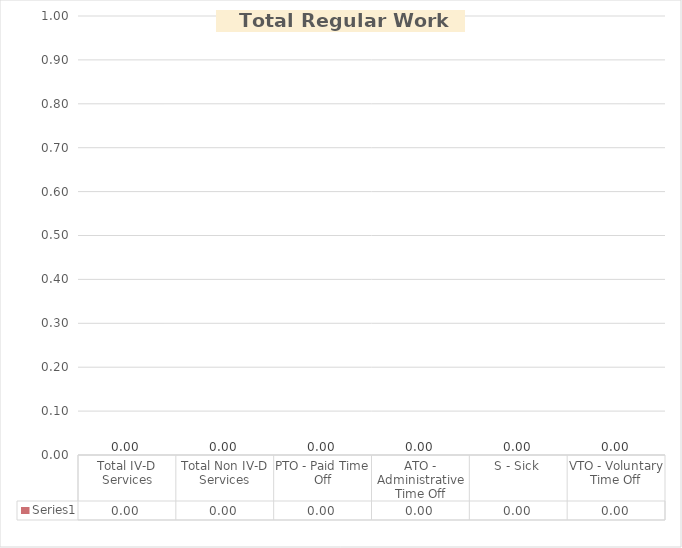
| Category | Series 0 |
|---|---|
| Total IV-D Services | 0 |
| Total Non IV-D Services | 0 |
| PTO - Paid Time Off | 0 |
| ATO - Administrative Time Off | 0 |
| S - Sick | 0 |
| VTO - Voluntary Time Off | 0 |